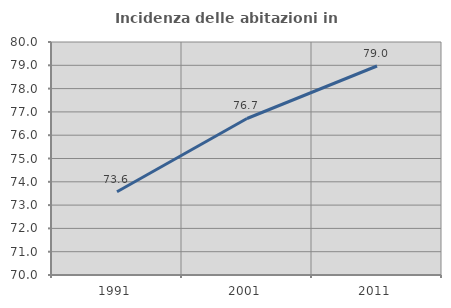
| Category | Incidenza delle abitazioni in proprietà  |
|---|---|
| 1991.0 | 73.574 |
| 2001.0 | 76.717 |
| 2011.0 | 78.969 |